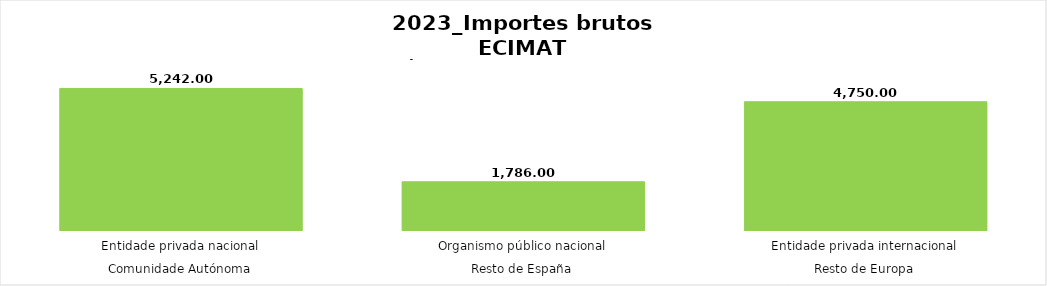
| Category | Series 0 |
|---|---|
| 0 | 5242 |
| 1 | 1786 |
| 2 | 4750 |